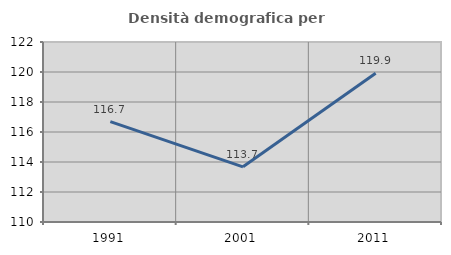
| Category | Densità demografica |
|---|---|
| 1991.0 | 116.695 |
| 2001.0 | 113.679 |
| 2011.0 | 119.913 |